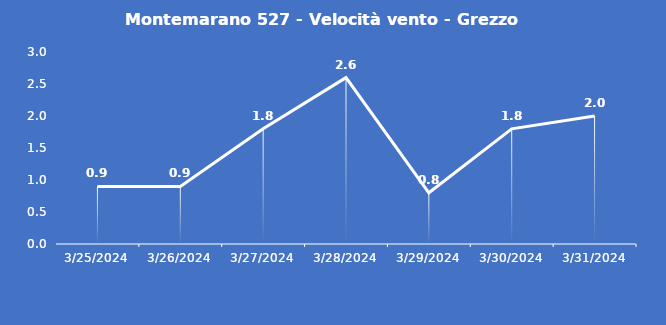
| Category | Montemarano 527 - Velocità vento - Grezzo (m/s) |
|---|---|
| 3/25/24 | 0.9 |
| 3/26/24 | 0.9 |
| 3/27/24 | 1.8 |
| 3/28/24 | 2.6 |
| 3/29/24 | 0.8 |
| 3/30/24 | 1.8 |
| 3/31/24 | 2 |